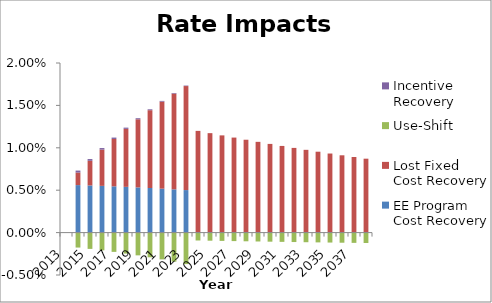
| Category | EE Program Cost Recovery | Lost Fixed Cost Recovery | Use-Shift | Incentive Recovery |
|---|---|---|---|---|
| 2013.0 | 0 | 0 | 0 | 0 |
| 2014.0 | 0.006 | 0.001 | -0.002 | 0 |
| 2015.0 | 0.006 | 0.003 | -0.002 | 0 |
| 2016.0 | 0.006 | 0.004 | -0.002 | 0 |
| 2017.0 | 0.005 | 0.006 | -0.002 | 0 |
| 2018.0 | 0.005 | 0.007 | -0.002 | 0 |
| 2019.0 | 0.005 | 0.008 | -0.003 | 0 |
| 2020.0 | 0.005 | 0.009 | -0.003 | 0 |
| 2021.0 | 0.005 | 0.01 | -0.003 | 0 |
| 2022.0 | 0.005 | 0.011 | -0.003 | 0 |
| 2023.0 | 0.005 | 0.012 | -0.004 | 0 |
| 2024.0 | 0 | 0.012 | -0.001 | 0 |
| 2025.0 | 0 | 0.012 | -0.001 | 0 |
| 2026.0 | 0 | 0.011 | -0.001 | 0 |
| 2027.0 | 0 | 0.011 | -0.001 | 0 |
| 2028.0 | 0 | 0.011 | -0.001 | 0 |
| 2029.0 | 0 | 0.011 | -0.001 | 0 |
| 2030.0 | 0 | 0.01 | -0.001 | 0 |
| 2031.0 | 0 | 0.01 | -0.001 | 0 |
| 2032.0 | 0 | 0.01 | -0.001 | 0 |
| 2033.0 | 0 | 0.01 | -0.001 | 0 |
| 2034.0 | 0 | 0.01 | -0.001 | 0 |
| 2035.0 | 0 | 0.009 | -0.001 | 0 |
| 2036.0 | 0 | 0.009 | -0.001 | 0 |
| 2037.0 | 0 | 0.009 | -0.001 | 0 |
| 2038.0 | 0 | 0.009 | -0.001 | 0 |